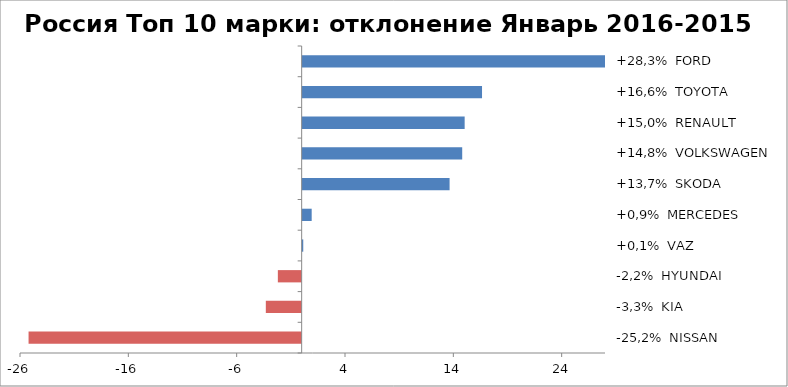
| Category | Россия Топ 10 марки: отклонение Январь 2016-2015 |
|---|---|
| -25,2%  NISSAN | -25.209 |
| -3,3%  KIA | -3.309 |
| -2,2%  HYUNDAI | -2.199 |
| +0,1%  VAZ | 0.146 |
| +0,9%  MERCEDES | 0.925 |
| +13,7%  SKODA | 13.654 |
| +14,8%  VOLKSWAGEN | 14.819 |
| +15,0%  RENAULT | 15.045 |
| +16,6%  TOYOTA | 16.649 |
| +28,3%  FORD | 28.303 |